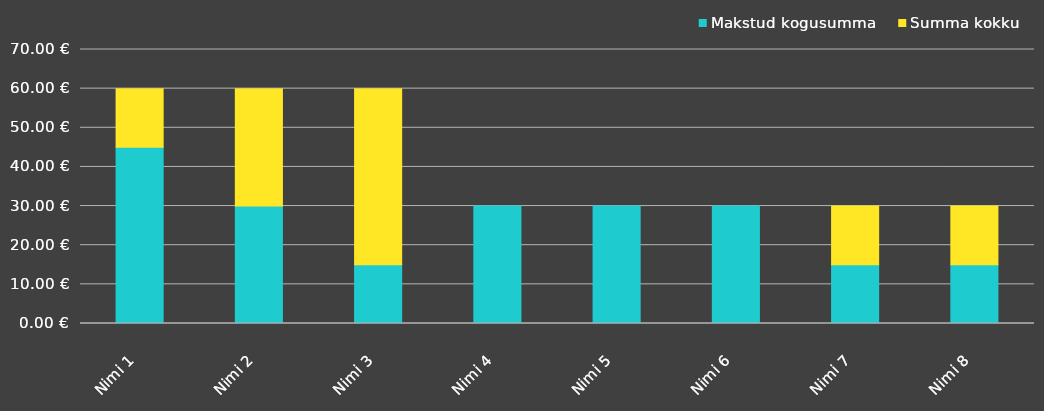
| Category | Makstud kogusumma | Summa kokku |
|---|---|---|
| Nimi 1 | 45 | 15 |
| Nimi 2 | 30 | 30 |
| Nimi 3 | 15 | 45 |
| Nimi 4 | 30 | 0 |
| Nimi 5 | 30 | 0 |
| Nimi 6 | 30 | 0 |
| Nimi 7 | 15 | 15 |
| Nimi 8 | 15 | 15 |